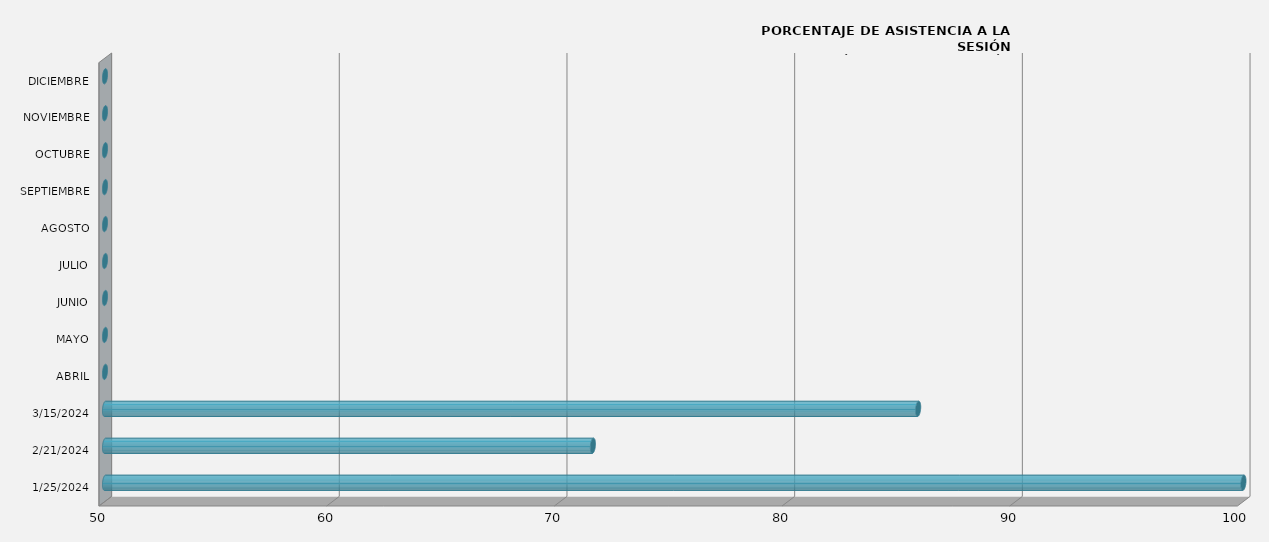
| Category | Series 0 |
|---|---|
| 25/01/2024 | 100 |
| 21/02/2024 | 71.429 |
| 15/03/2024 | 85.714 |
| ABRIL | 0 |
| MAYO | 0 |
| JUNIO | 0 |
| JULIO | 0 |
| AGOSTO | 0 |
| SEPTIEMBRE | 0 |
| OCTUBRE | 0 |
| NOVIEMBRE | 0 |
| DICIEMBRE | 0 |